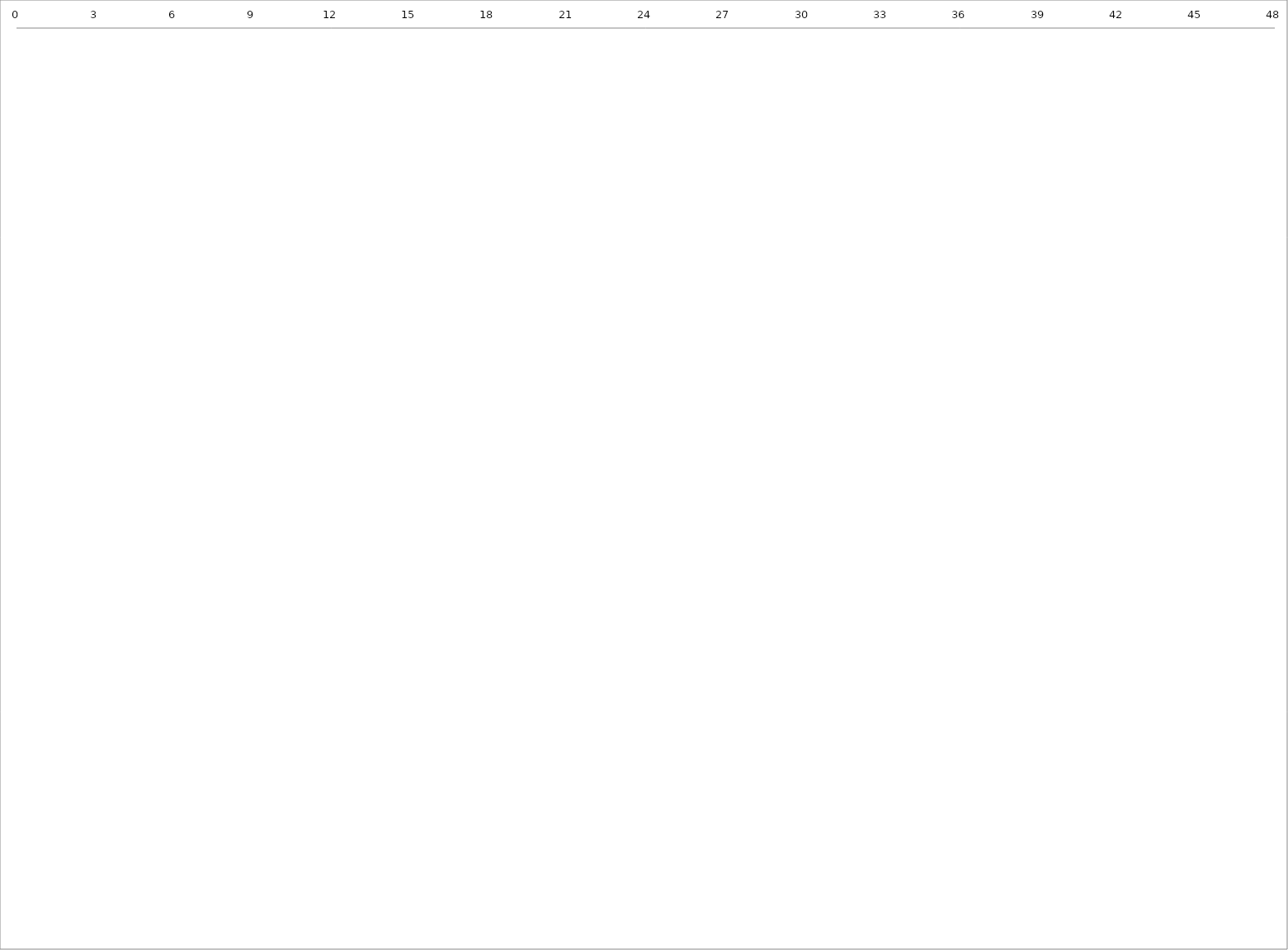
| Category | Started | Duration |
|---|---|---|
| 0.0 | 0 | 0 |
| 0.0 | 0 | 0 |
| 0.0 | 0 | 0 |
| 0.0 | 0 | 0 |
| 0.0 | 0 | 0 |
| 0.0 | 0 | 0 |
| 0.0 | 0 | 0 |
| 0.0 | 0 | 0 |
| 0.0 | 0 | 0 |
| 0.0 | 0 | 0 |
| 0.0 | 0 | 0 |
| 0.0 | 0 | 0 |
| 0.0 | 0 | 0 |
| 0.0 | 0 | 0 |
| 0.0 | 0 | 0 |
| 0.0 | 0 | 0 |
| 0.0 | 0 | 0 |
| 0.0 | 0 | 0 |
| 0.0 | 0 | 0 |
| 0.0 | 0 | 0 |
| 0.0 | 0 | 0 |
| 0.0 | 0 | 0 |
| 0.0 | 0 | 0 |
| 0.0 | 0 | 0 |
| 0.0 | 0 | 0 |
| 0.0 | 0 | 0 |
| 0.0 | 0 | 0 |
| 0.0 | 0 | 0 |
| 0.0 | 0 | 0 |
| 0.0 | 0 | 0 |
| 0.0 | 0 | 0 |
| 0.0 | 0 | 0 |
| 0.0 | 0 | 0 |
| 0.0 | 0 | 0 |
| 0.0 | 0 | 0 |
| 0.0 | 0 | 0 |
| 0.0 | 0 | 0 |
| 0.0 | 0 | 0 |
| 0.0 | 0 | 0 |